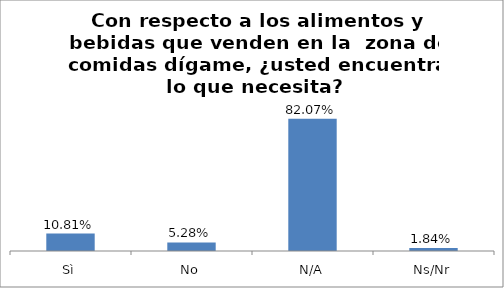
| Category | Total |
|---|---|
| Sì | 0.108 |
| No | 0.053 |
| N/A | 0.821 |
| Ns/Nr | 0.018 |